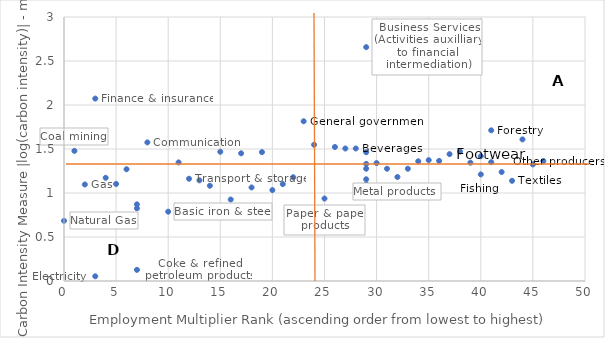
| Category | Mapping |
|---|---|
| 46.0 | 1.364 |
| 45.0 | 1.325 |
| 44.0 | 1.609 |
| 43.0 | 1.138 |
| 42.0 | 1.238 |
| 41.0 | 1.712 |
| 40.0 | 1.211 |
| 41.0 | 1.351 |
| 40.0 | 1.418 |
| 39.0 | 1.345 |
| 38.0 | 1.471 |
| 37.0 | 1.441 |
| 36.0 | 1.365 |
| 35.0 | 1.374 |
| 34.0 | 1.361 |
| 33.0 | 1.276 |
| 32.0 | 1.182 |
| 31.0 | 1.276 |
| 30.0 | 1.34 |
| 29.0 | 2.658 |
| 29.0 | 1.276 |
| 29.0 | 1.331 |
| 29.0 | 1.101 |
| 29.0 | 1.463 |
| 29.0 | 1.156 |
| 28.0 | 1.506 |
| 27.0 | 1.506 |
| 26.0 | 1.523 |
| 25.0 | 0.937 |
| 24.0 | 1.548 |
| 23.0 | 1.815 |
| 22.0 | 1.179 |
| 21.0 | 1.101 |
| 20.0 | 1.033 |
| 19.0 | 1.465 |
| 18.0 | 1.063 |
| 17.0 | 1.451 |
| 16.0 | 0.926 |
| 15.0 | 1.469 |
| 14.0 | 1.082 |
| 13.0 | 1.144 |
| 12.0 | 1.162 |
| 11.0 | 1.348 |
| 10.0 | 0.788 |
| 7.0 | 0.826 |
| 8.0 | 1.575 |
| 7.0 | 0.871 |
| 6.0 | 1.27 |
| 0.0 | 0.684 |
| 5.0 | 1.103 |
| 7.0 | 0.127 |
| 4.0 | 1.173 |
| 3.0 | 2.073 |
| 3.0 | 0.054 |
| 2.0 | 1.097 |
| 1.0 | 1.479 |